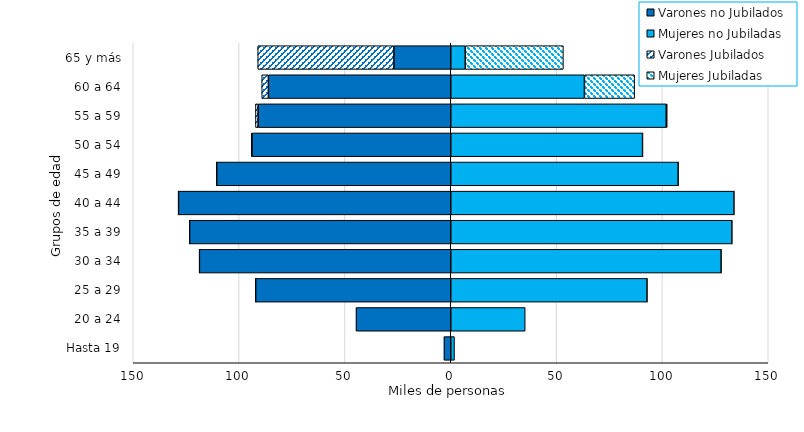
| Category | Varones no Jubilados | Mujeres no Jubiladas | Varones Jubilados | Mujeres Jubiladas |
|---|---|---|---|---|
| Hasta 19 | -3192 | 1765 | 0 | 0 |
| 20 a 24 | -44736 | 35171 | 0 | 0 |
| 25 a 29 | -92197 | 92797 | -6 | 1 |
| 30 a 34 | -118754 | 127794 | -22 | 3 |
| 35 a 39 | -123389 | 132883 | -52 | 20 |
| 40 a 44 | -128644 | 133850 | -81 | 37 |
| 45 a 49 | -110583 | 107466 | -149 | 73 |
| 50 a 54 | -93908 | 90633 | -276 | 147 |
| 55 a 59 | -91025 | 101805 | -1228 | 464 |
| 60 a 64 | -86157 | 63147 | -3138 | 23734 |
| 65 y más | -26850 | 6817 | -64336 | 46399 |